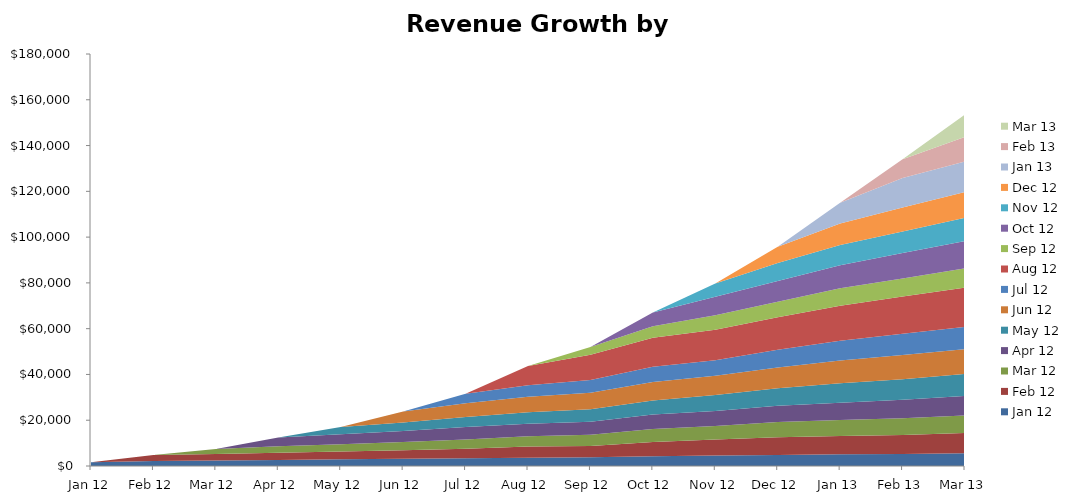
| Category | Jan 12 | Feb 12 | Mar 12 | Apr 12 | May 12 | Jun 12 | Jul 12 | Aug 12 | Sep 12 | Oct 12 | Nov 12 | Dec 12 | Jan 13 | Feb 13 | Mar 13 |
|---|---|---|---|---|---|---|---|---|---|---|---|---|---|---|---|
| Jan 12 | 1665 | 0 | 0 | 0 | 0 | 0 | 0 | 0 | 0 | 0 | 0 | 0 | 0 | 0 | 0 |
| Feb 12 | 2205 | 2556 | 0 | 0 | 0 | 0 | 0 | 0 | 0 | 0 | 0 | 0 | 0 | 0 | 0 |
| Mar 12 | 2448 | 2781 | 2151 | 0 | 0 | 0 | 0 | 0 | 0 | 0 | 0 | 0 | 0 | 0 | 0 |
| Apr 12 | 2610 | 3150 | 2889 | 3834 | 0 | 0 | 0 | 0 | 0 | 0 | 0 | 0 | 0 | 0 | 0 |
| May 12 | 2916 | 3375 | 3186 | 4374 | 3231 | 0 | 0 | 0 | 0 | 0 | 0 | 0 | 0 | 0 | 0 |
| Jun 12 | 3114 | 3735 | 3582 | 4851 | 3753 | 4761 | 0 | 0 | 0 | 0 | 0 | 0 | 0 | 0 | 0 |
| Jul 12 | 3339 | 4203 | 4077 | 5436 | 4302 | 6048 | 4185 | 0 | 0 | 0 | 0 | 0 | 0 | 0 | 0 |
| Aug 12 | 3636 | 4851 | 4563 | 5427 | 5022 | 6759 | 5022 | 8424 | 0 | 0 | 0 | 0 | 0 | 0 | 0 |
| Sep 12 | 3780 | 4986 | 4914 | 5688 | 5454 | 7182 | 5544 | 11088 | 3384 | 0 | 0 | 0 | 0 | 0 | 0 |
| Oct 12 | 4284 | 6237 | 5643 | 6345 | 6147 | 8046 | 6606 | 12699 | 5103 | 5904 | 0 | 0 | 0 | 0 | 0 |
| Nov 12 | 4581 | 6966 | 5958 | 6534 | 6984 | 8379 | 6759 | 13392 | 6345 | 8064 | 5778 | 0 | 0 | 0 | 0 |
| Dec 12 | 4860 | 7704 | 6696 | 7047 | 7713 | 9018 | 7722 | 14175 | 6822 | 9036 | 7938 | 7056 | 0 | 0 | 0 |
| Jan 13 | 5094 | 8046 | 6966 | 7542 | 8469 | 10008 | 8604 | 15291 | 7632 | 10107 | 8802 | 9333 | 9090 | 0 | 0 |
| Feb 13 | 5202 | 8343 | 7272 | 8118 | 9018 | 10503 | 9333 | 16254 | 7920 | 11061 | 9432 | 10512 | 12870 | 8136 | 0 |
| Mar 13 | 5625 | 8820 | 7596 | 8559 | 9639 | 10809 | 9738 | 17181 | 8397 | 11871 | 10161 | 11286 | 13383 | 10701 | 9765 |